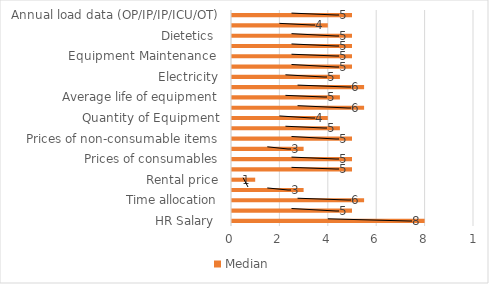
| Category | Median |
|---|---|
| HR Salary  | 8 |
| Leave data | 5 |
| Time allocation | 5.5 |
| Building area  | 3 |
| Rental price | 1 |
| Quantity of Consumables | 5 |
| Prices of consumables | 5 |
| Quantity of Furniture | 3 |
| Prices of non-consumable items | 5 |
| Average life of furniture items | 4.5 |
| Quantity of Equipment | 4 |
| Prices of Equipment | 5.5 |
| Average life of equipment | 4.5 |
| Utility of equipment  | 5.5 |
| Electricity | 4.5 |
| Building Maintenance  | 5 |
| Equipment Maintenance  | 5 |
| Laundry | 5 |
| Dietetics  | 5 |
| Biomedical Waste Management  | 4 |
| Annual load data (OP/IP/IP/ICU/OT) | 5 |